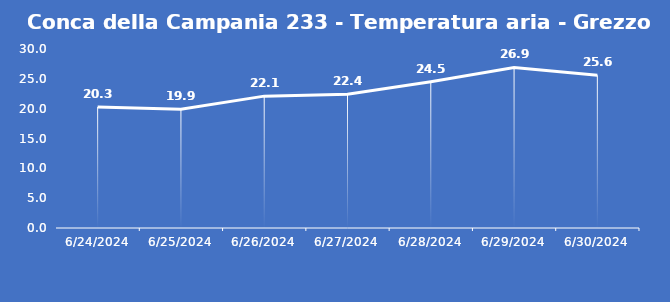
| Category | Conca della Campania 233 - Temperatura aria - Grezzo (°C) |
|---|---|
| 6/24/24 | 20.3 |
| 6/25/24 | 19.9 |
| 6/26/24 | 22.1 |
| 6/27/24 | 22.4 |
| 6/28/24 | 24.5 |
| 6/29/24 | 26.9 |
| 6/30/24 | 25.6 |